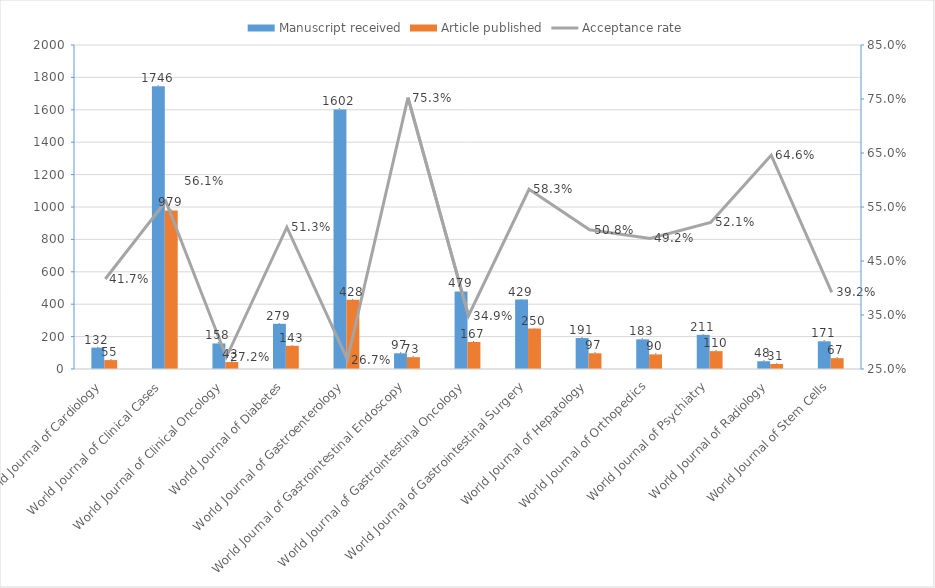
| Category | Manuscript received | Article published |
|---|---|---|
| World Journal of Cardiology | 132 | 55 |
| World Journal of Clinical Cases | 1746 | 979 |
| World Journal of Clinical Oncology | 158 | 43 |
| World Journal of Diabetes | 279 | 143 |
| World Journal of Gastroenterology | 1602 | 428 |
| World Journal of Gastrointestinal Endoscopy | 97 | 73 |
| World Journal of Gastrointestinal Oncology | 479 | 167 |
| World Journal of Gastrointestinal Surgery | 429 | 250 |
| World Journal of Hepatology | 191 | 97 |
| World Journal of Orthopedics | 183 | 90 |
| World Journal of Psychiatry | 211 | 110 |
| World Journal of Radiology | 48 | 31 |
| World Journal of Stem Cells | 171 | 67 |